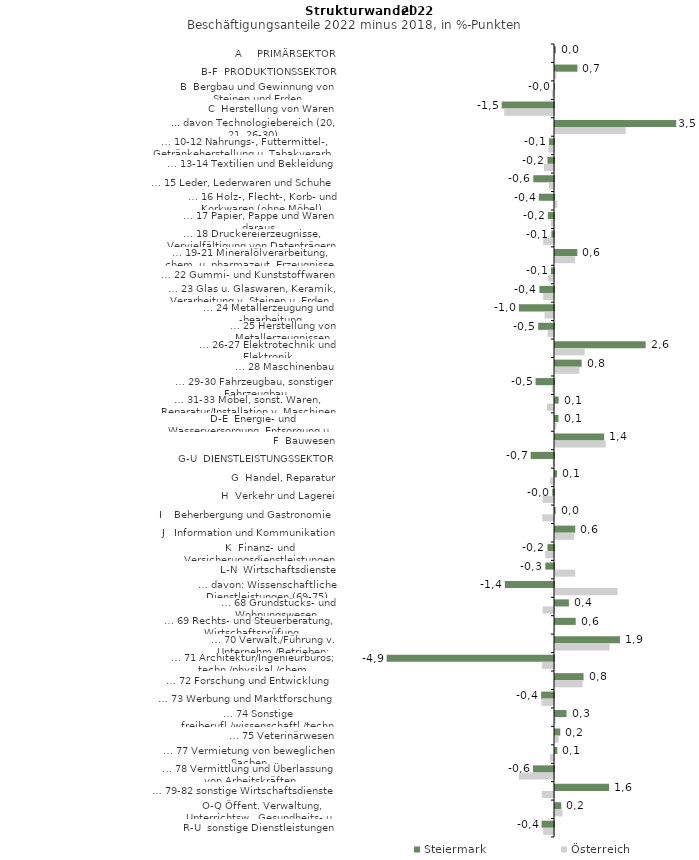
| Category | Steiermark | Österreich |
|---|---|---|
| A     PRIMÄRSEKTOR | 0.025 | 0.004 |
| B-F  PRODUKTIONSSEKTOR | 0.65 | 0.036 |
| B  Bergbau und Gewinnung von Steinen und Erden | -0.011 | -0.063 |
| C  Herstellung von Waren | -1.516 | -1.445 |
| ... davon Technologiebereich (20, 21, 26-30) | 3.513 | 2.047 |
| … 10-12 Nahrungs-, Futtermittel-, Getränkeherstellung u. Tabakverarb. | -0.143 | -0.163 |
| … 13-14 Textilien und Bekleidung | -0.189 | -0.292 |
| … 15 Leder, Lederwaren und Schuhe | -0.6 | -0.15 |
| … 16 Holz-, Flecht-, Korb- und Korkwaren (ohne Möbel)  | -0.44 | 0.068 |
| … 17 Papier, Pappe und Waren daraus  | -0.178 | -0.09 |
| … 18 Druckereierzeugnisse, Vervielfältigung von Datenträgern | -0.077 | -0.314 |
| … 19-21 Mineralölverarbeitung, chem. u. pharmazeut. Erzeugnisse | 0.646 | 0.584 |
| … 22 Gummi- und Kunststoffwaren | -0.089 | -0.168 |
| … 23 Glas u. Glaswaren, Keramik, Verarbeitung v. Steinen u. Erden  | -0.424 | -0.312 |
| … 24 Metallerzeugung und -bearbeitung | -1.019 | -0.276 |
| … 25 Herstellung von Metallerzeugnissen  | -0.459 | -0.185 |
| … 26-27 Elektrotechnik und Elektronik | 2.628 | 0.862 |
| … 28 Maschinenbau | 0.773 | 0.705 |
| … 29-30 Fahrzeugbau, sonstiger Fahrzeugbau | -0.534 | -0.066 |
| … 31-33 Möbel, sonst. Waren, Reparatur/Installation v. Maschinen | 0.106 | -0.204 |
| D-E  Energie- und Wasserversorgung, Entsorgung u. Rückgewinnung | 0.102 | 0.038 |
| F  Bauwesen | 1.424 | 1.469 |
| G-U  DIENSTLEISTUNGSSEKTOR | -0.676 | -0.04 |
| G  Handel, Reparatur | 0.059 | -0.115 |
| H  Verkehr und Lagerei | -0.05 | -0.33 |
| I    Beherbergung und Gastronomie | 0.02 | -0.34 |
| J   Information und Kommunikation | 0.588 | 0.551 |
| K  Finanz- und Versicherungsdienstleistungen | -0.188 | -0.255 |
| L-N  Wirtschaftsdienste | -0.252 | 0.586 |
| … davon: Wissenschaftliche Dienstleistungen (69-75) | -1.425 | 1.815 |
| … 68 Grundstücks- und Wohnungswesen  | 0.402 | -0.331 |
| … 69 Rechts- und Steuerberatung, Wirtschaftsprüfung | 0.6 | 0.008 |
| … 70 Verwalt./Führung v. Unternehm./Betrieben; Unternehmensberat. | 1.883 | 1.583 |
| … 71 Architektur/Ingenieurbüros; techn./physikal./chem. Untersuchung | -4.85 | -0.344 |
| … 72 Forschung und Entwicklung  | 0.828 | 0.797 |
| … 73 Werbung und Marktforschung | -0.372 | -0.361 |
| … 74 Sonstige freiberufl./wissenschaftl./techn. Tätigkeiten | 0.334 | 0.025 |
| … 75 Veterinärwesen | 0.152 | 0.108 |
| … 77 Vermietung von beweglichen Sachen  | 0.067 | -0.116 |
| … 78 Vermittlung und Überlassung von Arbeitskräften | -0.611 | -1.018 |
| … 79-82 sonstige Wirtschaftsdienste | 1.569 | -0.351 |
| O-Q Öffent. Verwaltung, Unterrichtsw., Gesundheits- u. Sozialwesen | 0.182 | 0.216 |
| R-U  sonstige Dienstleistungen | -0.359 | -0.314 |